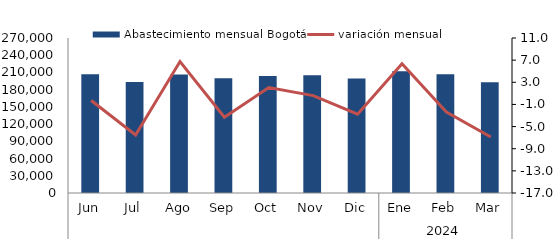
| Category | Abastecimiento mensual Bogotá |
|---|---|
| 0 | 207031.626 |
| 1 | 193540.689 |
| 2 | 206595.389 |
| 3 | 199736.721 |
| 4 | 203842.748 |
| 5 | 205049.889 |
| 6 | 199371.331 |
| 7 | 212001.678 |
| 8 | 207000.498 |
| 9 | 192773.122 |